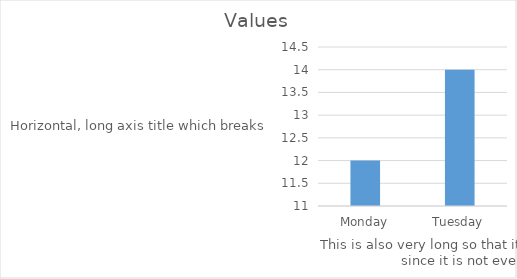
| Category | Values |
|---|---|
| Monday | 12 |
| Tuesday | 14 |